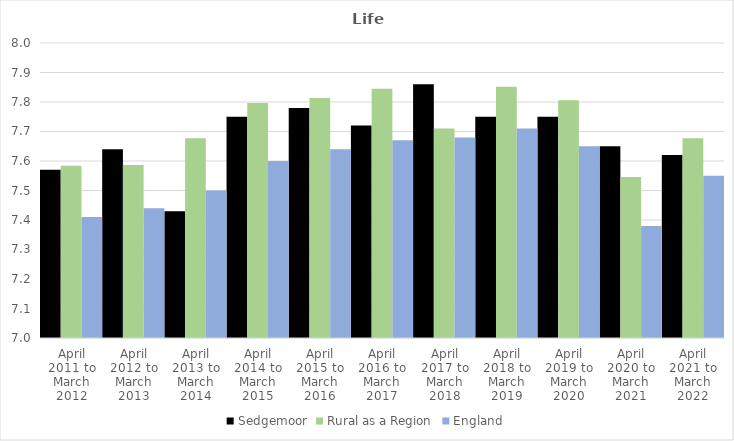
| Category | Sedgemoor | Rural as a Region | England |
|---|---|---|---|
| April 2011 to March 2012 | 7.57 | 7.584 | 7.41 |
| April 2012 to March 2013 | 7.64 | 7.586 | 7.44 |
| April 2013 to March 2014 | 7.43 | 7.677 | 7.5 |
| April 2014 to March 2015 | 7.75 | 7.797 | 7.6 |
| April 2015 to March 2016 | 7.78 | 7.813 | 7.64 |
| April 2016 to March 2017 | 7.72 | 7.845 | 7.67 |
| April 2017 to March 2018 | 7.86 | 7.71 | 7.68 |
| April 2018 to March 2019 | 7.75 | 7.852 | 7.71 |
| April 2019 to March 2020 | 7.75 | 7.806 | 7.65 |
| April 2020 to March 2021 | 7.65 | 7.546 | 7.38 |
| April 2021 to March 2022 | 7.62 | 7.677 | 7.55 |